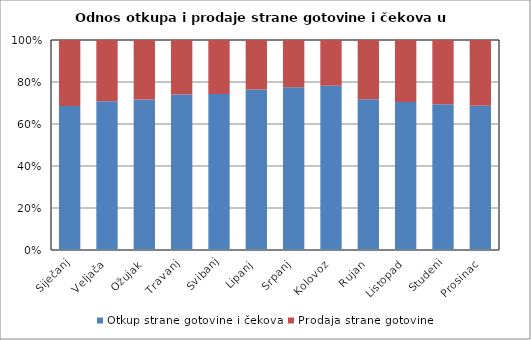
| Category | Otkup strane gotovine i čekova  | Prodaja strane gotovine  |
|---|---|---|
| Siječanj | 1040070691 | 476159841 |
| Veljača | 1036227628 | 425763152 |
| Ožujak | 1308589595 | 516029908 |
| Travanj | 1669573550 | 584338023 |
| Svibanj | 1696921504 | 588560654 |
| Lipanj | 2156203590 | 665040964 |
| Srpanj | 2893972766 | 840841413 |
| Kolovoz | 3580994073 | 994839010 |
| Rujan | 1892170019 | 744555815 |
| Listopad | 1609142445 | 674389010 |
| Studeni | 1174047275 | 516877820 |
| Prosinac | 1439103080 | 654985922 |